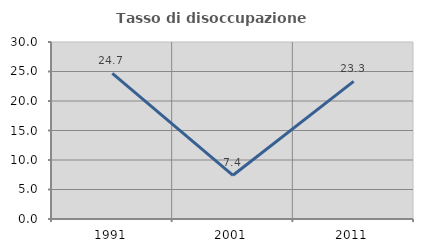
| Category | Tasso di disoccupazione giovanile  |
|---|---|
| 1991.0 | 24.675 |
| 2001.0 | 7.407 |
| 2011.0 | 23.333 |